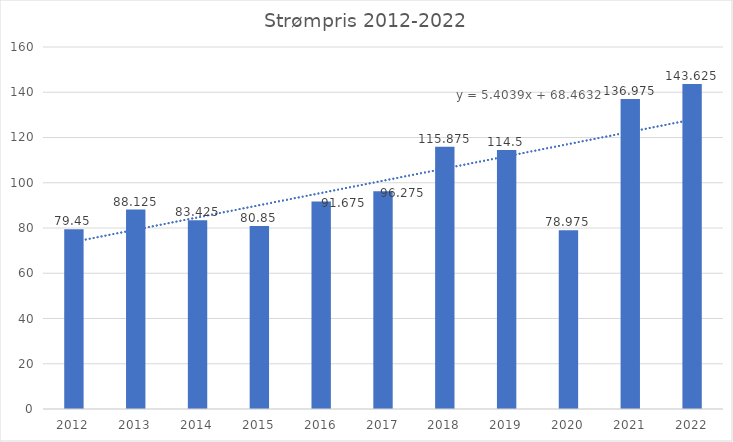
| Category | Series 0 |
|---|---|
| 2012.0 | 79.45 |
| 2013.0 | 88.125 |
| 2014.0 | 83.425 |
| 2015.0 | 80.85 |
| 2016.0 | 91.675 |
| 2017.0 | 96.275 |
| 2018.0 | 115.875 |
| 2019.0 | 114.5 |
| 2020.0 | 78.975 |
| 2021.0 | 136.975 |
| 2022.0 | 143.625 |